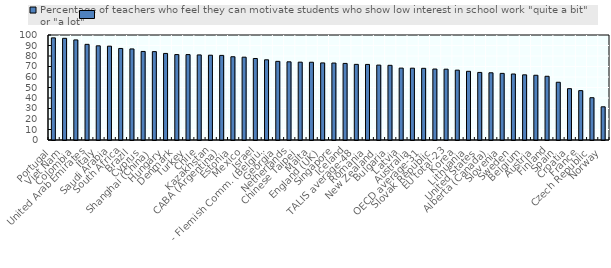
| Category | Percentage of teachers who feel they can motivate students who show low interest in school work "quite a bit" or "a lot" |
|---|---|
| Portugal | 97.266 |
| Viet Nam | 96.832 |
| Colombia | 95.325 |
| United Arab Emirates | 91.099 |
| Italy | 89.696 |
| Saudi Arabia | 89.357 |
| South Africa | 87.179 |
| Brazil | 86.74 |
| Cyprus | 84.338 |
| Shanghai (China) | 84.172 |
| Hungary | 82.45 |
| Denmark | 81.358 |
| Turkey | 81.35 |
| Chile | 81.029 |
| Kazakhstan | 80.755 |
| CABA (Argentina) | 80.567 |
| Estonia | 79.298 |
| Mexico | 78.873 |
| Israel | 77.626 |
|     - Flemish Comm. (Belgium) | 76.376 |
| Georgia | 74.905 |
| Netherlands | 74.45 |
| Chinese Taipei | 74.129 |
| Malta | 74.06 |
| England (UK) | 73.411 |
| Singapore | 73.291 |
| Iceland | 72.941 |
| TALIS average-48 | 72.039 |
| Romania | 71.968 |
| New Zealand | 71.337 |
| Bulgaria | 71.122 |
| Latvia | 68.468 |
| Australia | 68.404 |
| OECD average-31 | 68.271 |
| Slovak Republic | 67.6 |
| EU total-23 | 67.442 |
| Korea | 66.526 |
| Lithuania | 65.42 |
| United States | 64.355 |
| Alberta (Canada) | 64.003 |
| Slovenia | 63.446 |
| Sweden | 62.859 |
| Belgium | 62.056 |
| Austria | 61.663 |
| Finland | 60.695 |
| Spain | 54.991 |
| Croatia | 48.888 |
| France | 47.035 |
| Czech Republic | 40.273 |
| Norway | 31.619 |